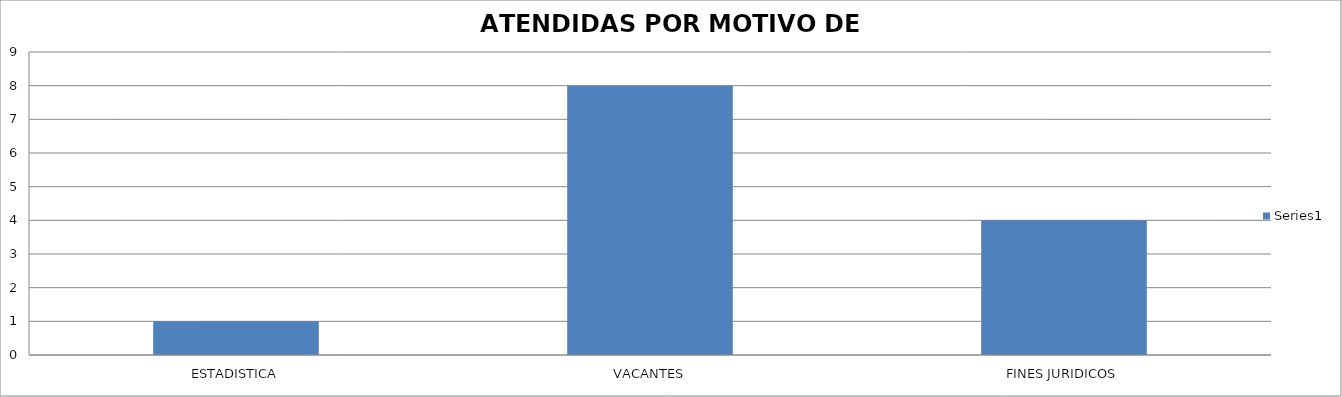
| Category | Series 0 |
|---|---|
| ESTADISTICA | 1 |
| VACANTES | 8 |
| FINES JURIDICOS | 4 |